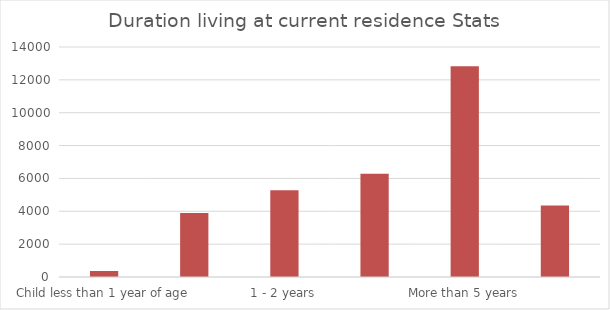
| Category | Series 1 |
|---|---|
| Child less than 1 year of age | 367 |
| Less than 1 year | 3902 |
| 1 - 2 years | 5279 |
| 3 - 5 years | 6292 |
| More than 5 years | 12835 |
| Prefer not to answer | 4357 |